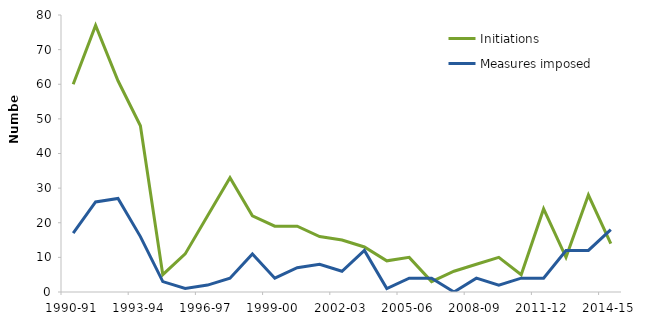
| Category | Initiations | Measures imposed |
|---|---|---|
| 1990-91 | 60 | 17 |
| 1991-92 | 77 | 26 |
| 1992-93 | 61 | 27 |
| 1993-94 | 48 | 16 |
| 1994-95 | 5 | 3 |
| 1995-96 | 11 | 1 |
| 1996-97 | 22 | 2 |
| 1997-98 | 33 | 4 |
| 1998-99 | 22 | 11 |
| 1999-00 | 19 | 4 |
| 2000-01 | 19 | 7 |
| 2001-02 | 16 | 8 |
| 2002-03 | 15 | 6 |
| 2003-04 | 13 | 12 |
| 2004-05 | 9 | 1 |
| 2005-06 | 10 | 4 |
| 2006-07 | 3 | 4 |
| 2007-08 | 6 | 0 |
| 2008-09 | 8 | 4 |
| 2009-10 | 10 | 2 |
| 2010-11 | 5 | 4 |
| 2011-12 | 24 | 4 |
| 2012-13 | 10 | 12 |
| 2013-14 | 28 | 12 |
| 2014-15 | 14 | 18 |